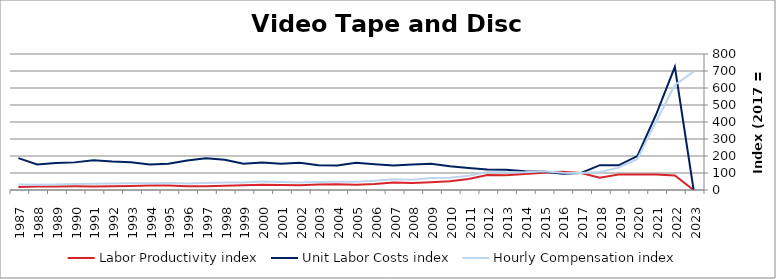
| Category | Labor Productivity index | Unit Labor Costs index | Hourly Compensation index |
|---|---|---|---|
| 2023.0 | 0 | 0 | 696.348 |
| 2022.0 | 85.256 | 724.464 | 617.651 |
| 2021.0 | 90.738 | 444.112 | 402.979 |
| 2020.0 | 90.727 | 199.316 | 180.834 |
| 2019.0 | 90.779 | 145.033 | 131.66 |
| 2018.0 | 72.654 | 146.304 | 106.295 |
| 2017.0 | 100 | 100 | 100 |
| 2016.0 | 107.096 | 95.124 | 101.873 |
| 2015.0 | 101.379 | 108.646 | 110.144 |
| 2014.0 | 93.965 | 110.764 | 104.079 |
| 2013.0 | 87.319 | 119.603 | 104.436 |
| 2012.0 | 88.083 | 120.348 | 106.006 |
| 2011.0 | 64.373 | 129.615 | 83.437 |
| 2010.0 | 51.663 | 139.853 | 72.252 |
| 2009.0 | 45.435 | 154.918 | 70.387 |
| 2008.0 | 40.504 | 150.124 | 60.806 |
| 2007.0 | 44.001 | 144.151 | 63.428 |
| 2006.0 | 35.61 | 152.188 | 54.194 |
| 2005.0 | 30.209 | 159.595 | 48.212 |
| 2004.0 | 33.595 | 144.264 | 48.465 |
| 2003.0 | 32.51 | 145.154 | 47.189 |
| 2002.0 | 27.876 | 159.739 | 44.529 |
| 2001.0 | 30.129 | 154.771 | 46.631 |
| 2000.0 | 30.58 | 161.141 | 49.277 |
| 1999.0 | 28.561 | 153.81 | 43.929 |
| 1998.0 | 24.913 | 177.552 | 44.233 |
| 1997.0 | 22.007 | 186.333 | 41.006 |
| 1996.0 | 22.471 | 173.246 | 38.93 |
| 1995.0 | 26.385 | 154.367 | 40.729 |
| 1994.0 | 26.872 | 149.44 | 40.158 |
| 1993.0 | 24.138 | 163.218 | 39.398 |
| 1992.0 | 22.561 | 167.286 | 37.741 |
| 1991.0 | 21.208 | 174.269 | 36.959 |
| 1990.0 | 21.556 | 162.497 | 35.028 |
| 1989.0 | 20.163 | 158.609 | 31.981 |
| 1988.0 | 20.74 | 150.433 | 31.199 |
| 1987.0 | 17.032 | 187.467 | 31.929 |